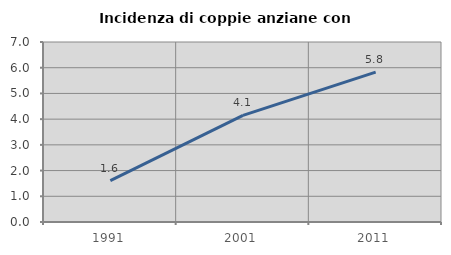
| Category | Incidenza di coppie anziane con figli |
|---|---|
| 1991.0 | 1.606 |
| 2001.0 | 4.149 |
| 2011.0 | 5.83 |